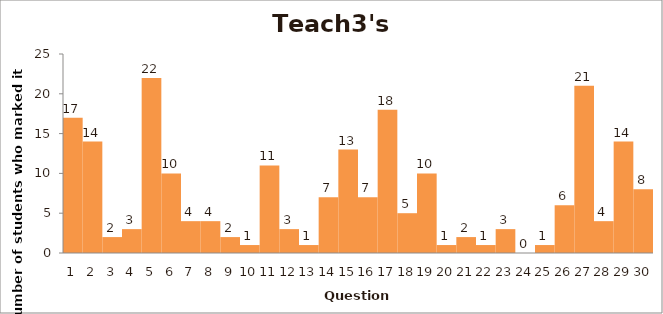
| Category | Series 0 |
|---|---|
| 0 | 17 |
| 1 | 14 |
| 2 | 2 |
| 3 | 3 |
| 4 | 22 |
| 5 | 10 |
| 6 | 4 |
| 7 | 4 |
| 8 | 2 |
| 9 | 1 |
| 10 | 11 |
| 11 | 3 |
| 12 | 1 |
| 13 | 7 |
| 14 | 13 |
| 15 | 7 |
| 16 | 18 |
| 17 | 5 |
| 18 | 10 |
| 19 | 1 |
| 20 | 2 |
| 21 | 1 |
| 22 | 3 |
| 23 | 0 |
| 24 | 1 |
| 25 | 6 |
| 26 | 21 |
| 27 | 4 |
| 28 | 14 |
| 29 | 8 |